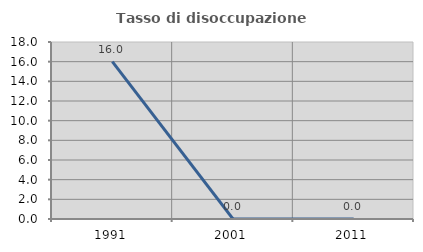
| Category | Tasso di disoccupazione giovanile  |
|---|---|
| 1991.0 | 16 |
| 2001.0 | 0 |
| 2011.0 | 0 |